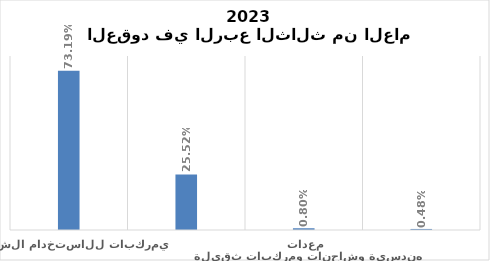
| Category | Series 0 |
|---|---|
| مركبات للاستخدام الشخصي  | 0.732 |
| مركبات للاستخدام التجاري  | 0.255 |
| معدات هندسية وشاحنات ومركبات ثقيلة | 0.008 |
| مال منقول | 0.005 |